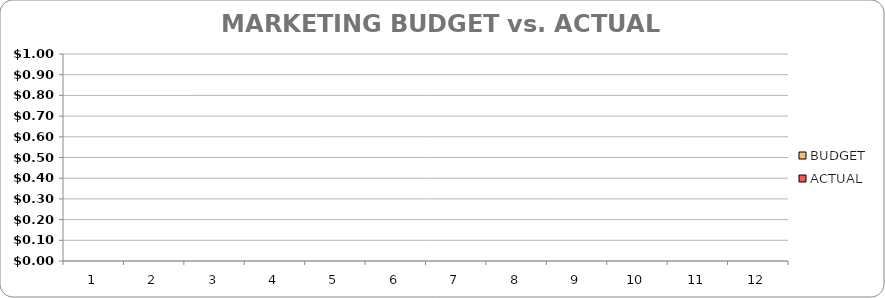
| Category | BUDGET | ACTUAL |
|---|---|---|
| 0 | 0 | 0 |
| 1 | 18476 | 0 |
| 2 | 4050 | 0 |
| 3 | 4050 | 0 |
| 4 | 19026 | 0 |
| 5 | 4300 | 0 |
| 6 | 4300 | 0 |
| 7 | 15726 | 0 |
| 8 | 4300 | 0 |
| 9 | 0 | 0 |
| 10 | 0 | 0 |
| 11 | 0 | 0 |